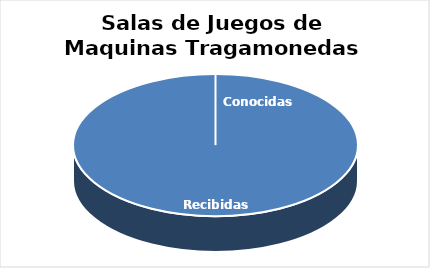
| Category | Series 0 |
|---|---|
| 0 | 24 |
| 1 | 0 |